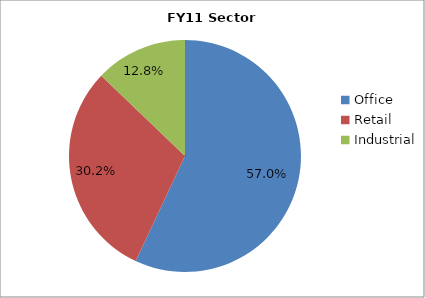
| Category | Series 0 |
|---|---|
| Office | 0.57 |
| Retail | 0.302 |
| Industrial | 0.128 |